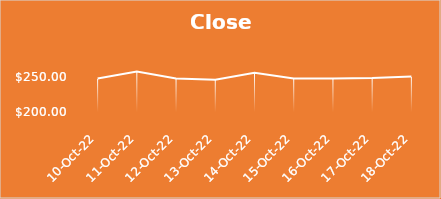
| Category | Close |
|---|---|
| 2022-10-10 | 247.8 |
| 2022-10-11 | 257.86 |
| 2022-10-12 | 247.96 |
| 2022-10-13 | 246.2 |
| 2022-10-14 | 256.05 |
| 2022-10-15 | 248.03 |
| 2022-10-16 | 247.82 |
| 2022-10-17 | 248.45 |
| 2022-10-18 | 250.66 |